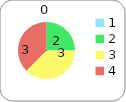
| Category | Series 0 |
|---|---|
| 0 | 0 |
| 1 | 2 |
| 2 | 3 |
| 3 | 3 |